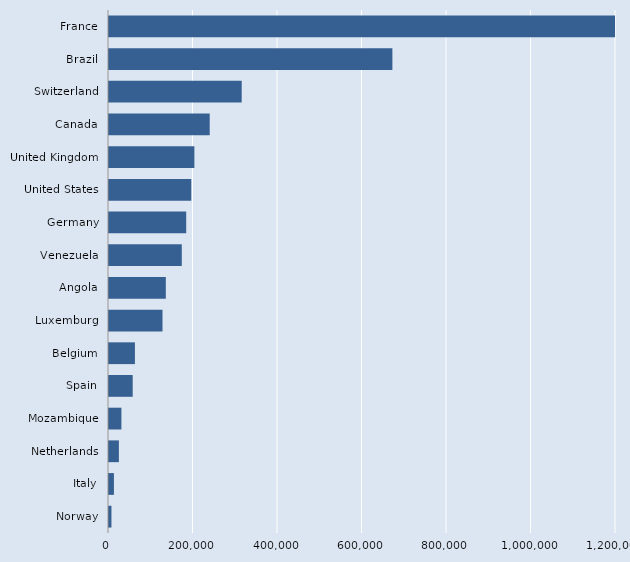
| Category | Series 0 |
|---|---|
| Norway | 5775 |
| Italy | 11673 |
| Netherlands | 23409 |
| Mozambique | 29360 |
| Spain | 56104 |
| Belgium | 61376 |
| Luxemburg | 126602 |
| Angola | 134473 |
| Venezuela | 172266 |
| Germany | 182762 |
| United States | 194728 |
| United Kingdom | 202072 |
| Canada | 238369 |
| Switzerland | 314081 |
| Brazil | 670760 |
| France | 1346472 |